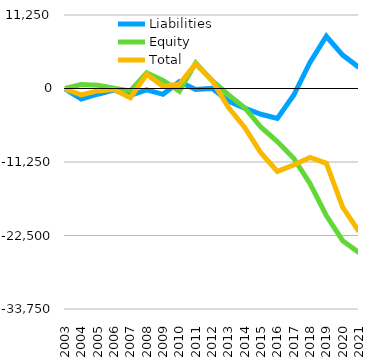
| Category | Liabilities  | Equity  | Total |
|---|---|---|---|
| 2003 | -84.454 | 9.924 | -74.53 |
| 2004 | -1597.354 | 608.183 | -989.171 |
| 2005 | -874.935 | 503.618 | -371.317 |
| 2006 | -230.287 | 61.619 | -168.668 |
| 2007 | -1047.797 | -358.496 | -1406.293 |
| 2008 | -216.596 | 2400.219 | 2183.623 |
| 2009 | -886.827 | 1224.93 | 338.103 |
| 2010 | 1047.229 | -404.298 | 642.931 |
| 2011 | -151.771 | 3921.702 | 3769.931 |
| 2012 | 16.729 | 1226.018 | 1242.747 |
| 2013 | -1922.271 | -947.982 | -2870.253 |
| 2014 | -3005.271 | -2942.982 | -5948.253 |
| 2015 | -3940.271 | -5930.982 | -9871.253 |
| 2016 | -4565.271 | -8125.982 | -12691.253 |
| 2017 | -1039.271 | -10668.982 | -11708.253 |
| 2018 | 4001.729 | -14551.982 | -10550.253 |
| 2019 | 7998.729 | -19450.982 | -11452.253 |
| 2020 | 5119.729 | -23288.982 | -18169.253 |
| 2021 | 3215.729 | -25122.982 | -21907.253 |